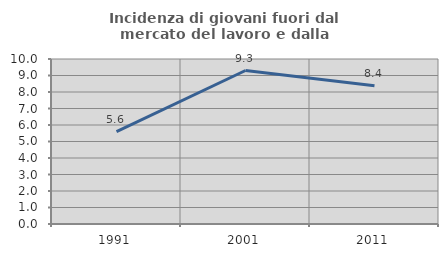
| Category | Incidenza di giovani fuori dal mercato del lavoro e dalla formazione  |
|---|---|
| 1991.0 | 5.6 |
| 2001.0 | 9.302 |
| 2011.0 | 8.383 |